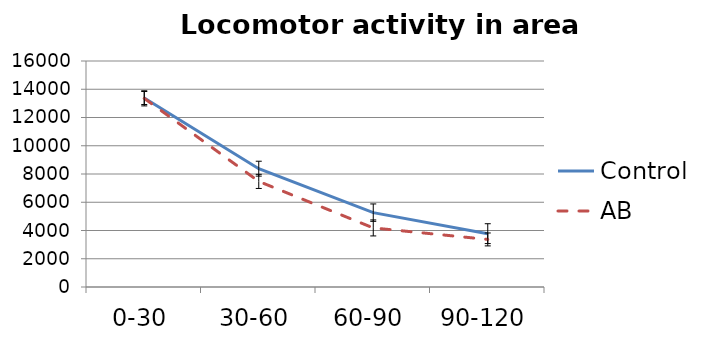
| Category | Control | AB |
|---|---|---|
| 0-30 | 13379.762 | 13355.611 |
| 30-60 | 8377.619 | 7476.111 |
| 60-90 | 5264.143 | 4182.889 |
| 90-120 | 3776.333 | 3367.222 |